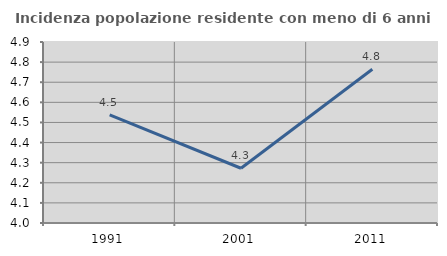
| Category | Incidenza popolazione residente con meno di 6 anni |
|---|---|
| 1991.0 | 4.537 |
| 2001.0 | 4.272 |
| 2011.0 | 4.765 |